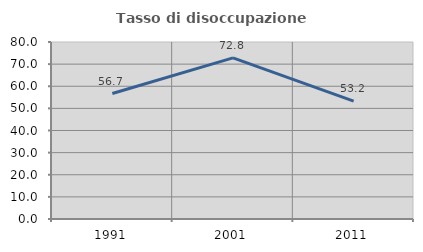
| Category | Tasso di disoccupazione giovanile  |
|---|---|
| 1991.0 | 56.723 |
| 2001.0 | 72.807 |
| 2011.0 | 53.247 |